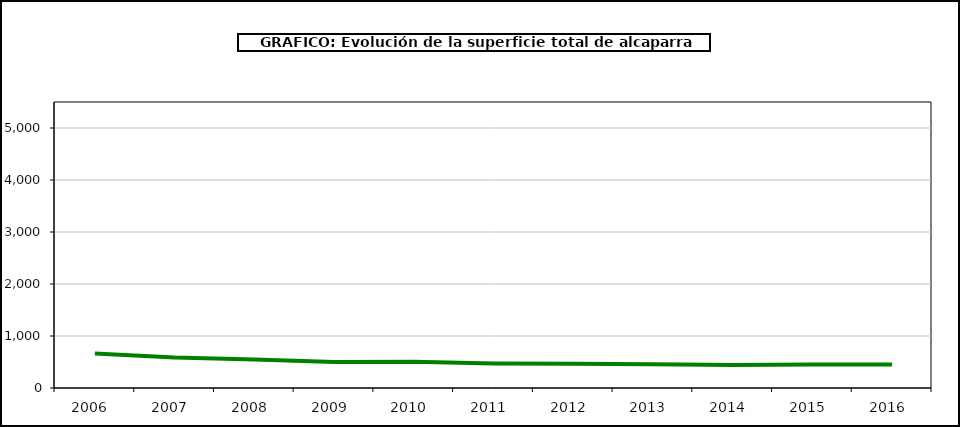
| Category | superficie |
|---|---|
| 2006.0 | 662 |
| 2007.0 | 588 |
| 2008.0 | 548 |
| 2009.0 | 501 |
| 2010.0 | 504 |
| 2011.0 | 471 |
| 2012.0 | 467 |
| 2013.0 | 456 |
| 2014.0 | 443 |
| 2015.0 | 450 |
| 2016.0 | 453 |